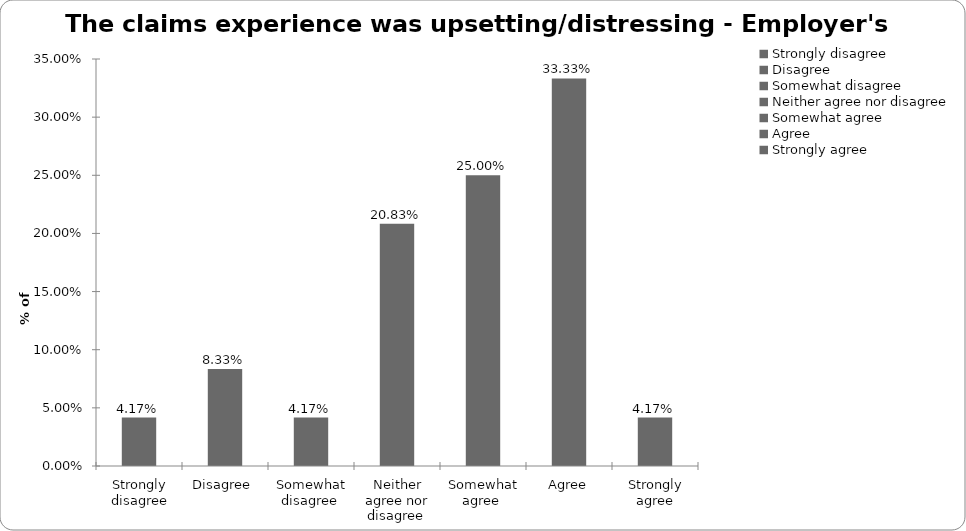
| Category | Series 0 |
|---|---|
| Strongly disagree | 0.042 |
| Disagree  | 0.083 |
| Somewhat disagree  | 0.042 |
| Neither agree nor disagree  | 0.208 |
| Somewhat agree  | 0.25 |
| Agree | 0.333 |
| Strongly agree | 0.042 |